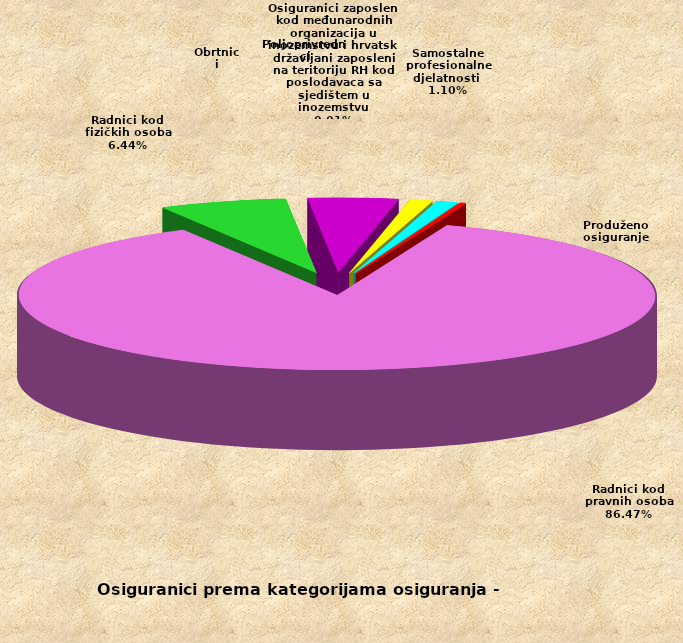
| Category | Series 0 |
|---|---|
| Radnici kod pravnih osoba | 1401550 |
| Radnici kod fizičkih osoba | 104445 |
| Obrtnici | 73817 |
| Poljoprivrednici | 18583 |
| Samostalne profesionalne djelatnosti  | 17880 |
| Osiguranici zaposleni kod međunarodnih organizacija u inozemstvu i hrvatski državljani zaposleni na teritoriju RH kod poslodavaca sa sjedištem u inozemstvu | 84 |
| Produženo osiguranje | 4432 |